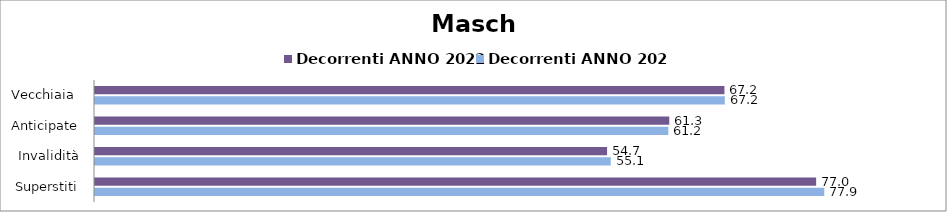
| Category | Decorrenti ANNO 2022 | Decorrenti ANNO 2023 |
|---|---|---|
| Vecchiaia  | 67.2 | 67.24 |
| Anticipate | 61.31 | 61.21 |
| Invalidità | 54.67 | 55.06 |
| Superstiti | 76.99 | 77.86 |